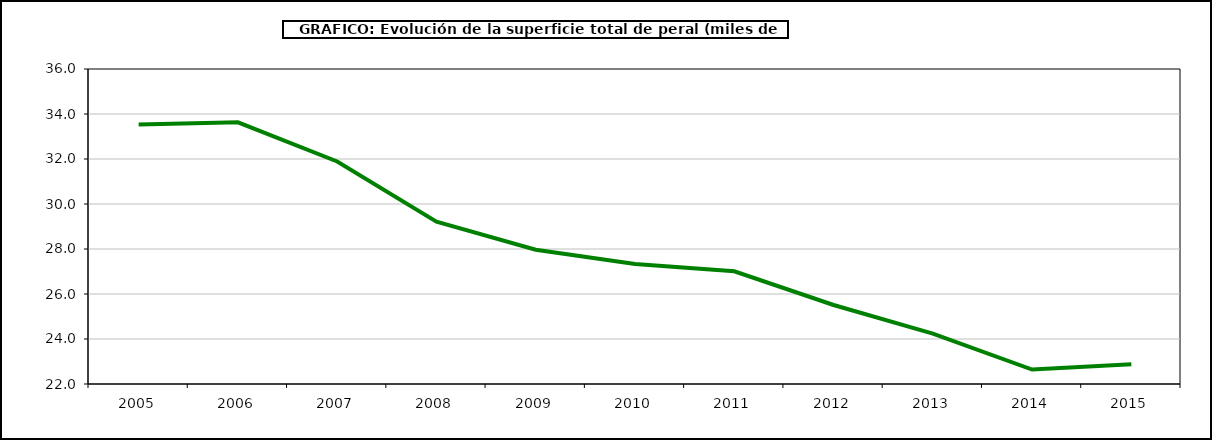
| Category | superficie peral |
|---|---|
| 2005.0 | 33.535 |
| 2006.0 | 33.63 |
| 2007.0 | 31.891 |
| 2008.0 | 29.216 |
| 2009.0 | 27.967 |
| 2010.0 | 27.331 |
| 2011.0 | 27.01 |
| 2012.0 | 25.512 |
| 2013.0 | 24.243 |
| 2014.0 | 22.643 |
| 2015.0 | 22.878 |